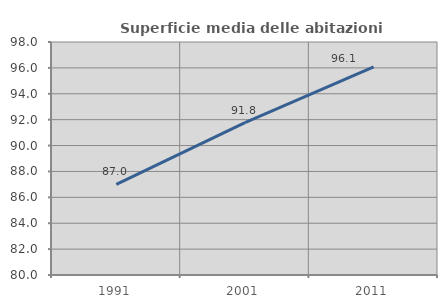
| Category | Superficie media delle abitazioni occupate |
|---|---|
| 1991.0 | 87 |
| 2001.0 | 91.771 |
| 2011.0 | 96.081 |